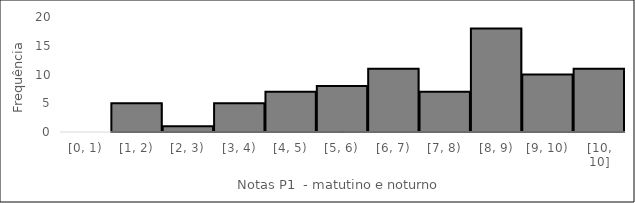
| Category | Freq. |
|---|---|
| [0, 1) | 0 |
| [1, 2) | 5 |
| [2, 3) | 1 |
| [3, 4) | 5 |
| [4, 5) | 7 |
| [5, 6) | 8 |
| [6, 7) | 11 |
| [7, 8) | 7 |
| [8, 9) | 18 |
| [9, 10) | 10 |
| [10, 10] | 11 |